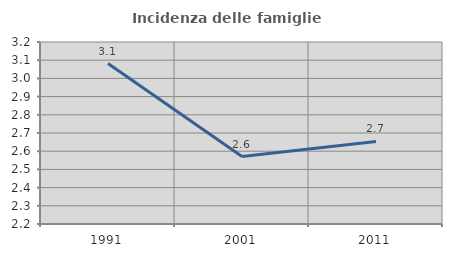
| Category | Incidenza delle famiglie numerose |
|---|---|
| 1991.0 | 3.082 |
| 2001.0 | 2.571 |
| 2011.0 | 2.654 |